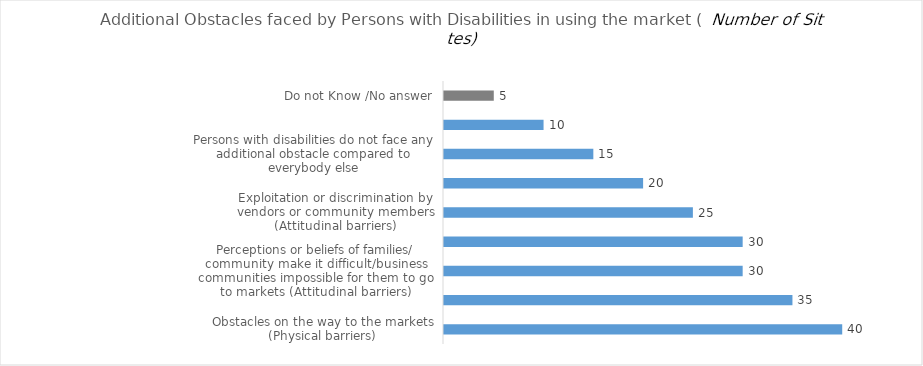
| Category | Additional Obstacles faced by Persons with Disabilities in using the market |
|---|---|
| Obstacles on the way to the markets (Physical barriers) | 40 |
| Obstacles at the market (Physical barriers) | 35 |
| Perceptions or beliefs of families/ community make it difficult/business communities impossible for them to go to markets (Attitudinal barriers) | 30 |
| Fear of harassment/ violence/ abuse on the way to market or at the market (Attitudinal barriers) | 30 |
| Exploitation or discrimination by vendors or community members (Attitudinal barriers) | 25 |
| Persons with disabilities have difficulties communicating with vendors (communication barrier),  | 20 |
| Persons with disabilities do not face any additional obstacle compared to everybody else | 15 |
| Others (specify) | 10 |
| Do not Know /No answer | 5 |